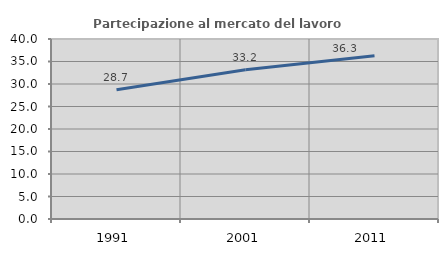
| Category | Partecipazione al mercato del lavoro  femminile |
|---|---|
| 1991.0 | 28.713 |
| 2001.0 | 33.157 |
| 2011.0 | 36.255 |